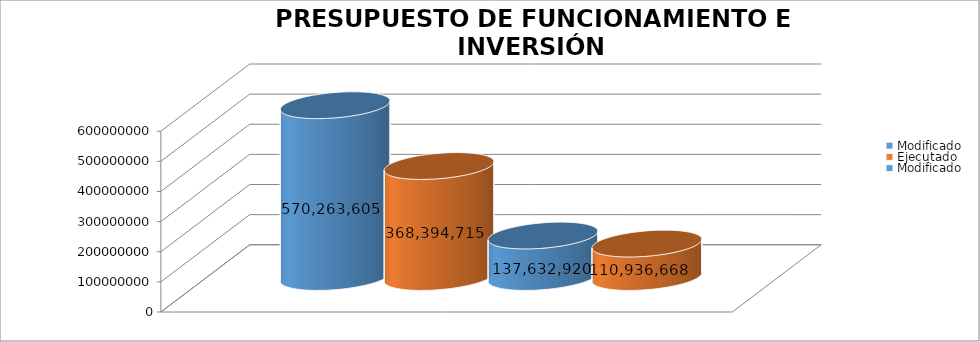
| Category | Modificado | Ejecutado | Series 2 |
|---|---|---|---|
| 0 | 137632920 | 110936668.21 |  |